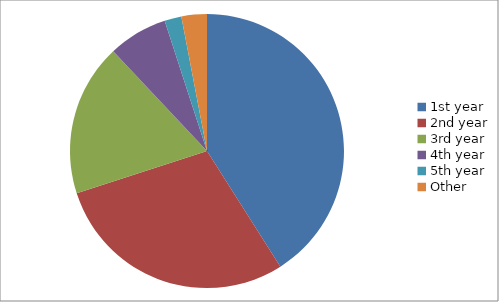
| Category | Percentage |
|---|---|
| 1st year | 41 |
| 2nd year | 29 |
| 3rd year | 18 |
| 4th year | 7 |
| 5th year | 2 |
| Other | 3 |